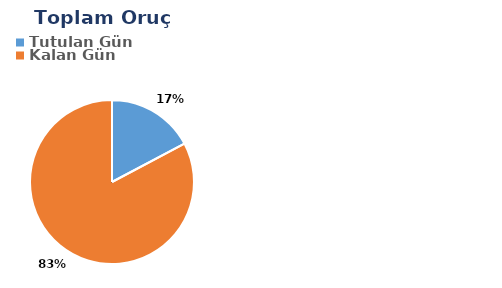
| Category | Toplam |
|---|---|
| Tutulan Gün | 5 |
| Kalan Gün | 24 |